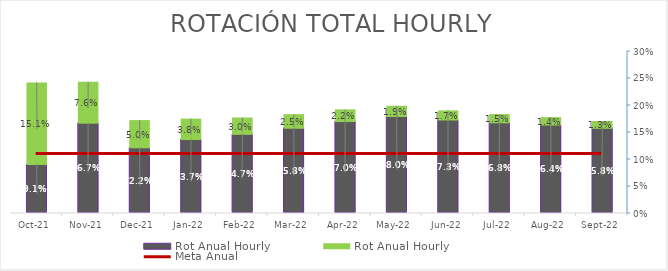
| Category | Rot Anual Hourly |
|---|---|
| 2021-10-01 | 0.151 |
| 2021-11-01 | 0.076 |
| 2021-12-01 | 0.05 |
| 2022-01-01 | 0.038 |
| 2022-02-01 | 0.03 |
| 2022-03-01 | 0.025 |
| 2022-04-01 | 0.022 |
| 2022-05-01 | 0.019 |
| 2022-06-01 | 0.017 |
| 2022-07-01 | 0.015 |
| 2022-08-01 | 0.014 |
| 2022-09-01 | 0.013 |